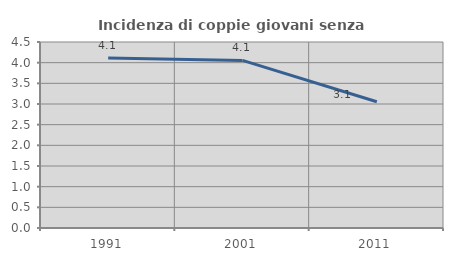
| Category | Incidenza di coppie giovani senza figli |
|---|---|
| 1991.0 | 4.112 |
| 2001.0 | 4.055 |
| 2011.0 | 3.053 |